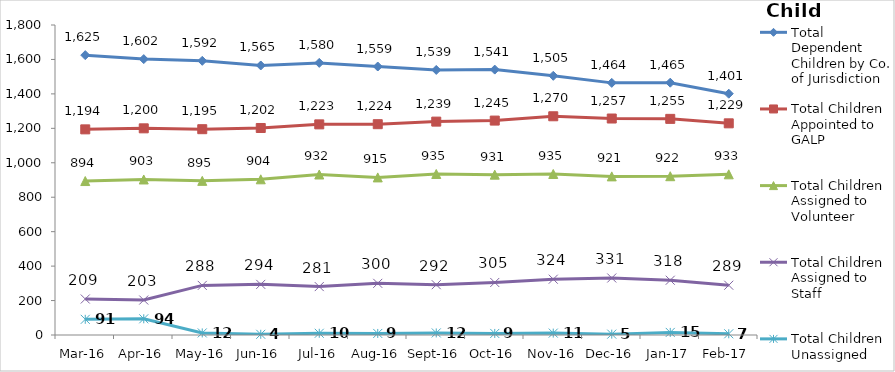
| Category | Total Dependent Children by Co. of Jurisdiction | Total Children Appointed to GALP | Total Children Assigned to Volunteer | Total Children Assigned to Staff | Total Children Unassigned |
|---|---|---|---|---|---|
| Mar-16 | 1625 | 1194 | 894 | 209 | 91 |
| Apr-16 | 1602 | 1200 | 903 | 203 | 94 |
| May-16 | 1592 | 1195 | 895 | 288 | 12 |
| Jun-16 | 1565 | 1202 | 904 | 294 | 4 |
| Jul-16 | 1580 | 1223 | 932 | 281 | 10 |
| Aug-16 | 1559 | 1224 | 915 | 300 | 9 |
| Sep-16 | 1539 | 1239 | 935 | 292 | 12 |
| Oct-16 | 1541 | 1245 | 931 | 305 | 9 |
| Nov-16 | 1505 | 1270 | 935 | 324 | 11 |
| Dec-16 | 1464 | 1257 | 921 | 331 | 5 |
| Jan-17 | 1465 | 1255 | 922 | 318 | 15 |
| Feb-17 | 1401 | 1229 | 933 | 289 | 7 |